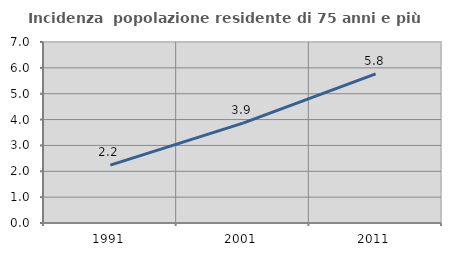
| Category | Incidenza  popolazione residente di 75 anni e più |
|---|---|
| 1991.0 | 2.239 |
| 2001.0 | 3.863 |
| 2011.0 | 5.771 |